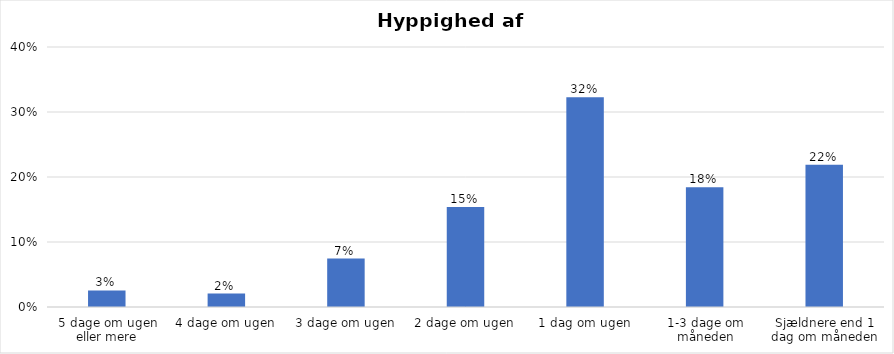
| Category | % |
|---|---|
| 5 dage om ugen eller mere | 0.025 |
| 4 dage om ugen | 0.021 |
| 3 dage om ugen | 0.075 |
| 2 dage om ugen | 0.154 |
| 1 dag om ugen | 0.323 |
| 1-3 dage om måneden | 0.184 |
| Sjældnere end 1 dag om måneden | 0.219 |